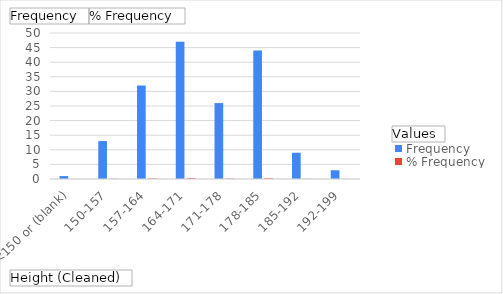
| Category | Frequency | % Frequency |
|---|---|---|
| <150 or (blank) | 1 | 0.006 |
| 150-157 | 13 | 0.074 |
| 157-164 | 32 | 0.183 |
| 164-171 | 47 | 0.269 |
| 171-178 | 26 | 0.149 |
| 178-185 | 44 | 0.251 |
| 185-192 | 9 | 0.051 |
| 192-199 | 3 | 0.017 |